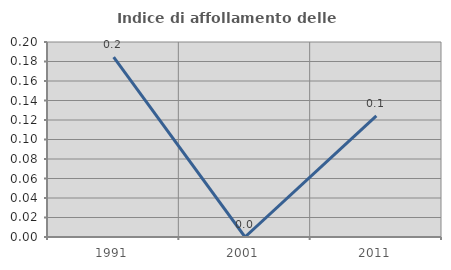
| Category | Indice di affollamento delle abitazioni  |
|---|---|
| 1991.0 | 0.185 |
| 2001.0 | 0 |
| 2011.0 | 0.124 |